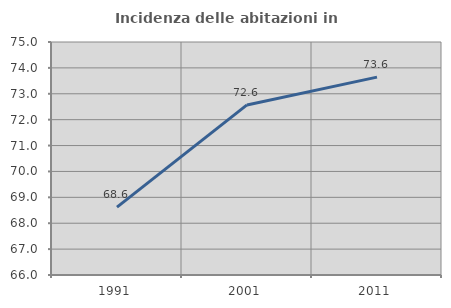
| Category | Incidenza delle abitazioni in proprietà  |
|---|---|
| 1991.0 | 68.622 |
| 2001.0 | 72.569 |
| 2011.0 | 73.642 |